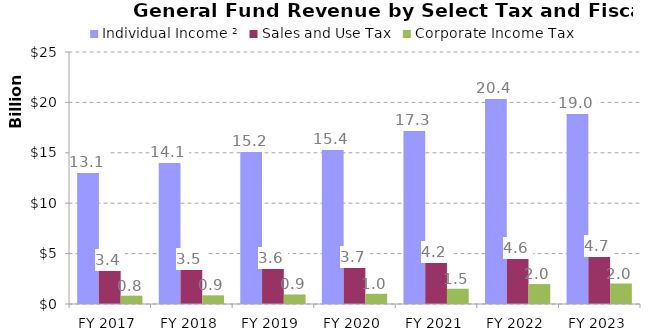
| Category | Individual Income ² | Sales and Use Tax | Corporate Income Tax  |
|---|---|---|---|
| FY 2017 | 13052887000 | 3354561000 | 826960822.31 |
| FY 2018 | 14105766000 | 3458249000 | 861897138.18 |
| FY 2019 | 15226471000 | 3580355000 | 943391000 |
| FY 2020 | 15351592000 | 3706817000 | 1011650000 |
| FY 2021 | 17303666000 | 4166182000 | 1515692000 |
| FY 2022 | 20410203000 | 4558082000 | 1978697000 |
| FY 2023 | 18983555000 | 4734549000 | 2031120000 |